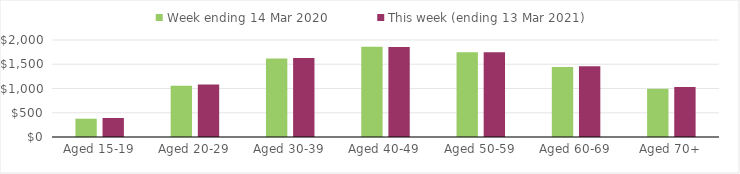
| Category | Week ending 14 Mar 2020 | This week (ending 13 Mar 2021) |
|---|---|---|
| Aged 15-19 | 376.96 | 391.37 |
| Aged 20-29 | 1058.67 | 1083.9 |
| Aged 30-39 | 1617.61 | 1629.65 |
| Aged 40-49 | 1860.99 | 1856.35 |
| Aged 50-59 | 1746.87 | 1747.52 |
| Aged 60-69 | 1443.05 | 1457.88 |
| Aged 70+ | 995.16 | 1028.98 |